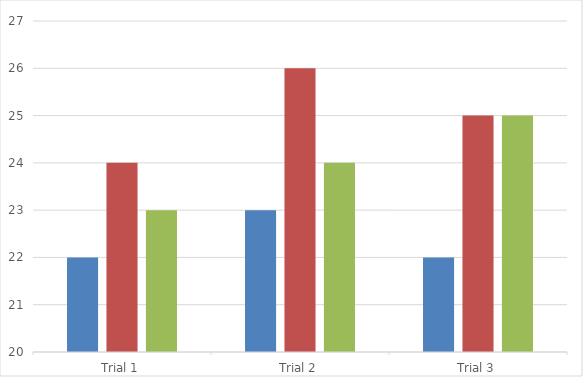
| Category | Tropicana | Minute Maid | Fresh Start |
|---|---|---|---|
| Trial 1 | 22 | 24 | 23 |
| Trial 2 | 23 | 26 | 24 |
| Trial 3 | 22 | 25 | 25 |